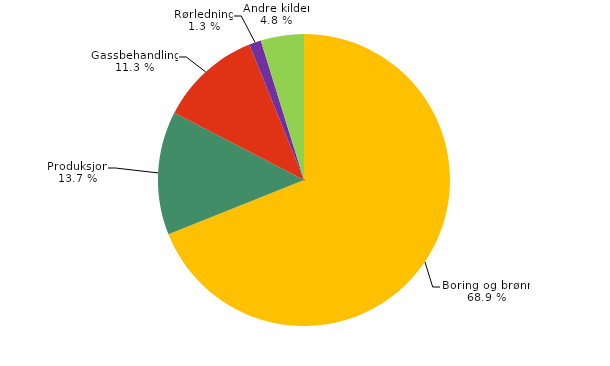
| Category | Series 0 |
|---|---|
| Boring og brønn | 104.873 |
| Produksjon | 20.802 |
| Gassbehandling | 17.169 |
| Rørledning | 2.014 |
| Andre kilder | 7.278 |